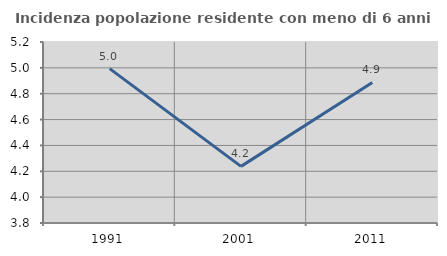
| Category | Incidenza popolazione residente con meno di 6 anni |
|---|---|
| 1991.0 | 4.994 |
| 2001.0 | 4.238 |
| 2011.0 | 4.887 |